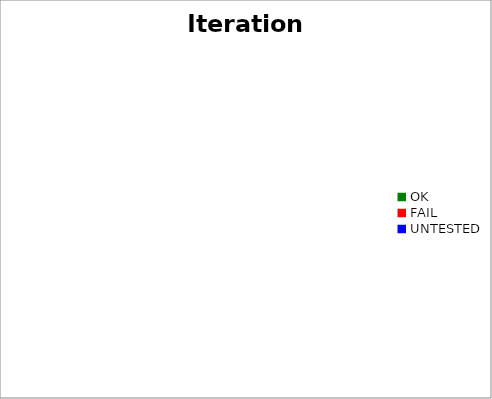
| Category | Iteration3 | Iteration1 |
|---|---|---|
| OK | 0 | 0.619 |
| FAIL | 0 | 0.115 |
| UNTESTED | 0 | 0.267 |